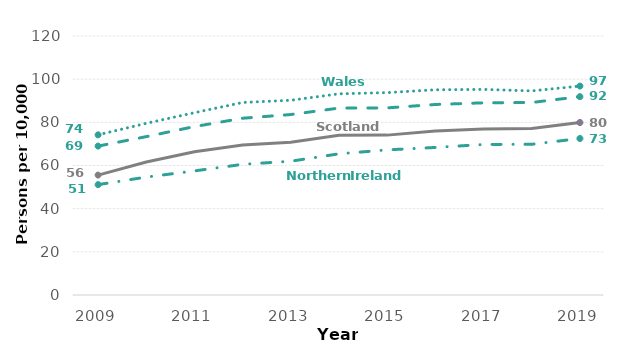
| Category | England | Wales | Northern Ireland | Scotland |
|---|---|---|---|---|
| 2009.0 | 68.993 | 74.205 | 51.134 | 55.563 |
| 2010.0 | 73.376 | 79.542 | 54.631 | 61.628 |
| 2011.0 | 78.035 | 84.471 | 57.487 | 66.36 |
| 2012.0 | 81.894 | 89.198 | 60.538 | 69.463 |
| 2013.0 | 83.617 | 90.222 | 61.977 | 70.743 |
| 2014.0 | 86.605 | 93.207 | 65.417 | 73.958 |
| 2015.0 | 86.695 | 93.77 | 67.238 | 74.074 |
| 2016.0 | 88.27 | 95.081 | 68.362 | 75.989 |
| 2017.0 | 89.041 | 95.259 | 69.755 | 76.924 |
| 2018.0 | 89.193 | 94.564 | 69.833 | 77.104 |
| 2019.0 | 91.901 | 96.8 | 72.505 | 79.915 |